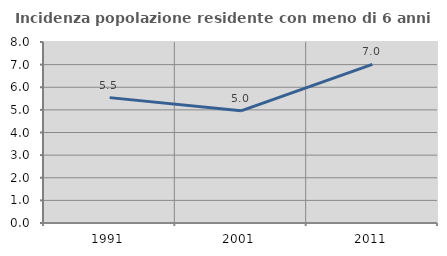
| Category | Incidenza popolazione residente con meno di 6 anni |
|---|---|
| 1991.0 | 5.542 |
| 2001.0 | 4.957 |
| 2011.0 | 7.013 |